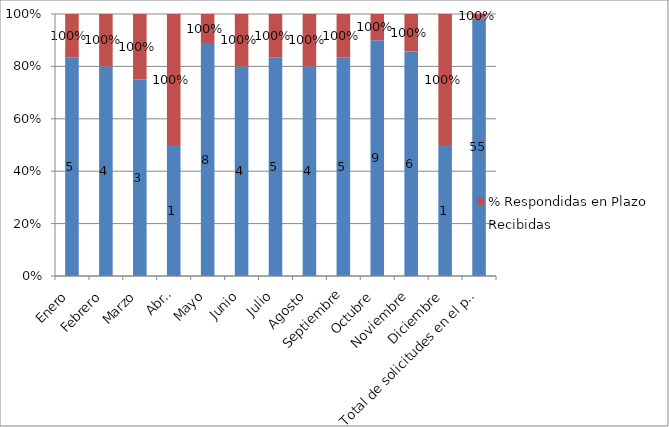
| Category | Recibidas | % Respondidas en Plazo |
|---|---|---|
| Enero | 5 | 1 |
| Febrero | 4 | 1 |
| Marzo | 3 | 1 |
| Abril | 1 | 1 |
| Mayo | 8 | 1 |
| Junio | 4 | 1 |
| Julio | 5 | 1 |
| Agosto | 4 | 1 |
| Septiembre | 5 | 1 |
| Octubre | 9 | 1 |
| Noviembre | 6 | 1 |
| Diciembre | 1 | 1 |
| Total de solicitudes en el periodo | 55 | 1 |